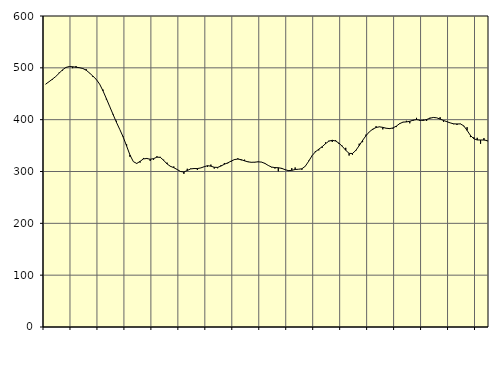
| Category | Piggar | Series 1 |
|---|---|---|
| nan | 468.3 | 468.64 |
| 87.0 | 473.2 | 473.27 |
| 87.0 | 477.1 | 478.19 |
| 87.0 | 483.4 | 483.36 |
| nan | 490.8 | 489.68 |
| 88.0 | 494.7 | 496.19 |
| 88.0 | 501.2 | 500.78 |
| 88.0 | 502.7 | 502.53 |
| nan | 499.3 | 502.12 |
| 89.0 | 503.5 | 501.16 |
| 89.0 | 499.8 | 500.27 |
| 89.0 | 499.3 | 498.77 |
| nan | 497.6 | 495.47 |
| 90.0 | 489.7 | 490.11 |
| 90.0 | 482.4 | 484.08 |
| 90.0 | 477.3 | 477.71 |
| nan | 468.5 | 468.56 |
| 91.0 | 458 | 455.62 |
| 91.0 | 438.8 | 440.61 |
| 91.0 | 425.5 | 425.21 |
| nan | 411 | 409.83 |
| 92.0 | 397.8 | 394.76 |
| 92.0 | 380.7 | 380.79 |
| 92.0 | 367.4 | 366.3 |
| nan | 352.6 | 349.25 |
| 93.0 | 328.4 | 331.86 |
| 93.0 | 319 | 319.08 |
| 93.0 | 314.9 | 315.53 |
| nan | 317.2 | 319.54 |
| 94.0 | 326.1 | 324.34 |
| 94.0 | 326.1 | 325.11 |
| 94.0 | 320.3 | 323.64 |
| nan | 322.6 | 324.79 |
| 95.0 | 329.4 | 327.69 |
| 95.0 | 328.2 | 327.28 |
| 95.0 | 322.7 | 321.52 |
| nan | 317.1 | 314.54 |
| 96.0 | 309.4 | 310.06 |
| 96.0 | 309.7 | 307.35 |
| 96.0 | 304.1 | 303.87 |
| nan | 300.6 | 299.99 |
| 97.0 | 295.4 | 299.1 |
| 97.0 | 305.3 | 301.93 |
| 97.0 | 305.7 | 304.98 |
| nan | 306.2 | 305.72 |
| 98.0 | 302.9 | 305.65 |
| 98.0 | 307 | 306.85 |
| 98.0 | 309.4 | 309.2 |
| nan | 309 | 311.21 |
| 99.0 | 313.3 | 310.31 |
| 99.0 | 305.6 | 308.15 |
| 99.0 | 306.2 | 307.92 |
| nan | 312.2 | 310.54 |
| 0.0 | 316.4 | 313.99 |
| 0.0 | 315.7 | 316.63 |
| 0.0 | 318.9 | 320.03 |
| nan | 323.8 | 323.02 |
| 1.0 | 325.5 | 323.99 |
| 1.0 | 321.6 | 322.84 |
| 1.0 | 322.8 | 320.55 |
| nan | 319.3 | 318.61 |
| 2.0 | 318.2 | 317.76 |
| 2.0 | 317.4 | 317.99 |
| 2.0 | 319.2 | 318.65 |
| nan | 318.4 | 318.16 |
| 3.0 | 315 | 315.73 |
| 3.0 | 311.8 | 311.75 |
| 3.0 | 308 | 308.57 |
| nan | 305.7 | 307.58 |
| 4.0 | 300.3 | 307.25 |
| 4.0 | 304.8 | 306.07 |
| 4.0 | 303.2 | 303.57 |
| nan | 302.6 | 301.65 |
| 5.0 | 306.5 | 302.21 |
| 5.0 | 307.8 | 303.84 |
| 5.0 | 304.4 | 304.35 |
| nan | 303.3 | 305.25 |
| 6.0 | 309.8 | 310.14 |
| 6.0 | 320.8 | 319.67 |
| 6.0 | 330.7 | 330.3 |
| nan | 339.5 | 337.97 |
| 7.0 | 340.7 | 342.98 |
| 7.0 | 345.6 | 347.82 |
| 7.0 | 356.2 | 353.62 |
| nan | 359.4 | 358.57 |
| 8.0 | 356.9 | 360.25 |
| 8.0 | 360.4 | 358.8 |
| 8.0 | 353 | 354.66 |
| nan | 349.6 | 348.44 |
| 9.0 | 345.7 | 340.89 |
| 9.0 | 330.8 | 334.98 |
| 9.0 | 332.3 | 334.72 |
| nan | 339.6 | 340.75 |
| 10.0 | 353.7 | 350.02 |
| 10.0 | 356.6 | 359.98 |
| 10.0 | 371.2 | 368.95 |
| nan | 376.6 | 376.46 |
| 11.0 | 380 | 381.64 |
| 11.0 | 387.4 | 384.91 |
| 11.0 | 385.9 | 386.21 |
| nan | 381.3 | 385.11 |
| 12.0 | 383 | 383.48 |
| 12.0 | 383.7 | 382.77 |
| 12.0 | 382.6 | 383.99 |
| nan | 385.7 | 387.49 |
| 13.0 | 393.1 | 392.34 |
| 13.0 | 395.6 | 395.27 |
| 13.0 | 397.8 | 395.65 |
| nan | 393 | 396.81 |
| 14.0 | 397.9 | 399.08 |
| 14.0 | 403.5 | 400.07 |
| 14.0 | 397.5 | 399.01 |
| nan | 400.2 | 398.5 |
| 15.0 | 397.5 | 400.33 |
| 15.0 | 403.7 | 402.81 |
| 15.0 | 403.9 | 404.26 |
| nan | 403.5 | 403.56 |
| 16.0 | 404.7 | 401.07 |
| 16.0 | 395.9 | 398.46 |
| 16.0 | 395.6 | 396.12 |
| nan | 393.6 | 393.76 |
| 17.0 | 391.3 | 392 |
| 17.0 | 389.7 | 391.73 |
| 17.0 | 392.2 | 391.84 |
| nan | 387.4 | 388.17 |
| 18.0 | 385.5 | 379.29 |
| 18.0 | 366.4 | 369.58 |
| 18.0 | 366.1 | 363.14 |
| nan | 365 | 360.83 |
| 19.0 | 353.5 | 360.81 |
| 19.0 | 364.4 | 360.7 |
| 19.0 | 358.3 | 359.62 |